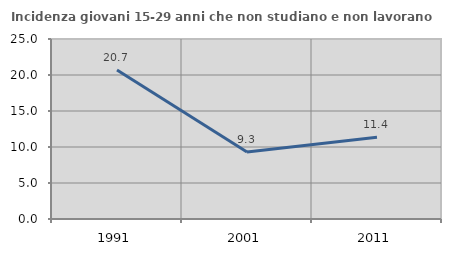
| Category | Incidenza giovani 15-29 anni che non studiano e non lavorano  |
|---|---|
| 1991.0 | 20.708 |
| 2001.0 | 9.302 |
| 2011.0 | 11.364 |